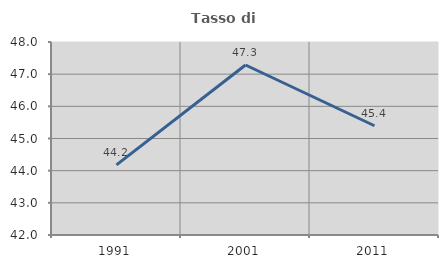
| Category | Tasso di occupazione   |
|---|---|
| 1991.0 | 44.179 |
| 2001.0 | 47.285 |
| 2011.0 | 45.396 |